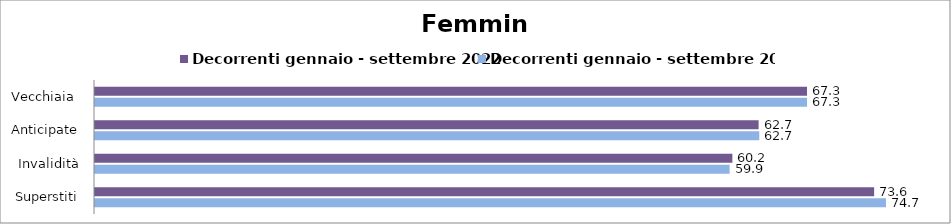
| Category | Decorrenti gennaio - settembre 2022 | Decorrenti gennaio - settembre 2023 |
|---|---|---|
| Vecchiaia  | 67.25 | 67.25 |
| Anticipate | 62.68 | 62.74 |
| Invalidità | 60.2 | 59.94 |
| Superstiti | 73.59 | 74.71 |